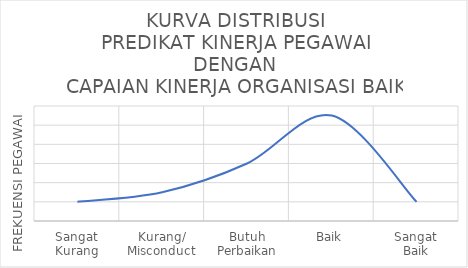
| Category | KURVA DISTRIBUSI
PREDIKAT KINERJA PEGAWAI DENGAN
CAPAIAN KINERJA ORGANISASI BAIK |
|---|---|
| Sangat
Kurang | 2 |
| Kurang/
Misconduct | 3 |
| Butuh
Perbaikan | 6 |
| Baik | 11 |
| Sangat
Baik | 2 |